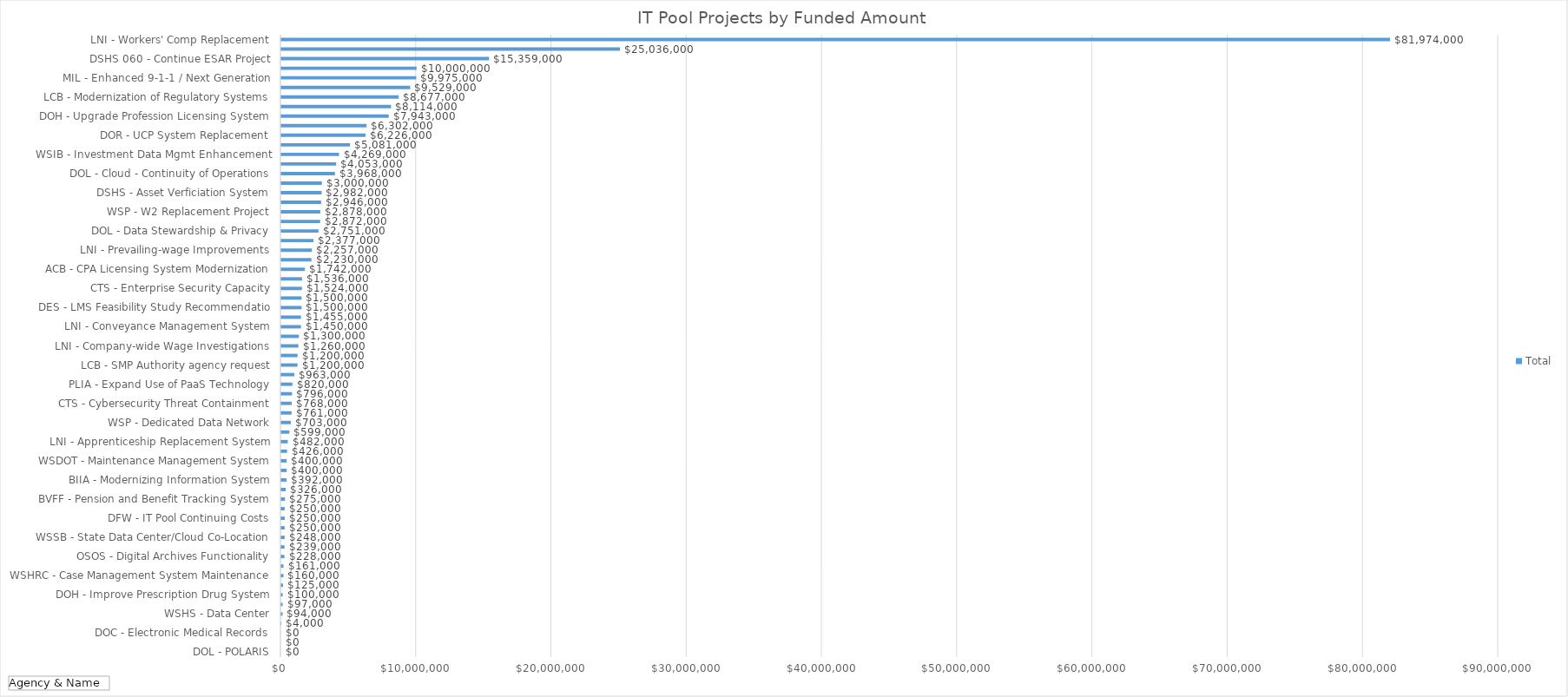
| Category | Total |
|---|---|
| DOL - POLARIS | 0 |
| SBCTC - CTCLink | 0 |
| DOC - Electronic Medical Records | 0 |
| OFM - Facilities Portfolio Mgmt | 4000 |
| WSHS - Data Center | 94000 |
| EWSHS - Connect to State Data Center | 97000 |
| DOH - Improve Prescription Drug System | 100000 |
| DOL - Appraisal Management Companies | 125000 |
| WSHRC - Case Management System Maintenance | 160000 |
| OSPI - State Board of Education ADA Access | 161000 |
| OSOS - Digital Archives Functionality | 228000 |
| PDC - Electronic Filing Modernization | 239000 |
| WSSB - State Data Center/Cloud Co-Location | 248000 |
| GAMB - Information Systems Modernization | 250000 |
| DFW - IT Pool Continuing Costs | 250000 |
| ECY - Records Management Using ECM | 250000 |
| BVFF - Pension and Benefit Tracking System | 275000 |
| WSDA - State Data Center Transfer | 326000 |
| BIIA - Modernizing Information System | 392000 |
| WSP - Case management | 400000 |
| WSDOT - Maintenance Management System | 400000 |
| CRGC - Access Database Replacement | 426000 |
| LNI - Apprenticeship Replacement System | 482000 |
| OIC - Enterprise Content Management | 599000 |
| WSP - Dedicated Data Network | 703000 |
| PARKS - Modernize Parks Technology | 761000 |
| CTS - Cybersecurity Threat Containment | 768000 |
| DRS - IT Security New Capabilities | 796000 |
| PLIA - Expand Use of PaaS Technology | 820000 |
| DFW - State Data Center Migration | 963000 |
| LCB - SMP Authority agency request | 1200000 |
| OFM - Education Research Data Center | 1200000 |
| LNI - Company-wide Wage Investigations | 1260000 |
| HCA HBE - Cloud Platform | 1300000 |
| LNI - Conveyance Management System | 1450000 |
| ECY - Integrated Grant and Revenue System | 1455000 |
| DES - LMS Feasibility Study Recommendatio | 1500000 |
| DCYF - Recruit & Retain Foster Parents | 1500000 |
| CTS - Enterprise Security Capacity | 1524000 |
| OFM - All Payer Claims Database | 1536000 |
| ACB - CPA Licensing System Modernization | 1742000 |
| DOH - Create Developmental Screening Tool | 2230000 |
| LNI - Prevailing-wage Improvements | 2257000 |
| OSPI - School Financial System | 2377000 |
| DOL - Data Stewardship & Privacy | 2751000 |
| LNI - Provider Credentialing System | 2872000 |
| WSP - W2 Replacement Project | 2878000 |
| HCA HBE - System Integrator | 2946000 |
| DSHS - Asset Verficiation System | 2982000 |
| WSDOT - CSC Toll Collection Reappropriation | 3000000 |
| DOL - Cloud - Continuity of Operations | 3968000 |
| DOL - Replacing Firearms Legacy System | 4053000 |
| WSIB - Investment Data Mgmt Enhancement | 4269000 |
| ESD - IT Continuity of Operations | 5081000 |
| DOR - UCP System Replacement | 6226000 |
| DSHS 110 - SILAS - Leave Attendance Scheduling | 6302000 |
| DOH - Upgrade Profession Licensing System | 7943000 |
| WSDOT - Labor System Replacement | 8114000 |
| LCB - Modernization of Regulatory Systems | 8677000 |
| DRS - Legacy System Replacement Program | 9529000 |
| MIL - Enhanced 9-1-1 / Next Generation | 9975000 |
| OFM - One WA System Readiness Planning | 10000000 |
| DSHS 060 - Continue ESAR Project | 15359000 |
| WSDOT - Land Mobile Radio | 25036000 |
| LNI - Workers' Comp Replacement | 81974000 |